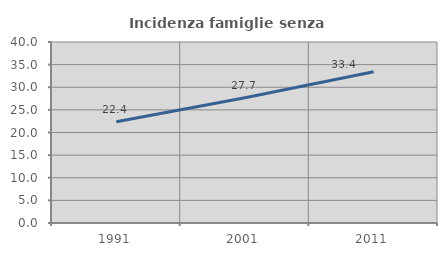
| Category | Incidenza famiglie senza nuclei |
|---|---|
| 1991.0 | 22.387 |
| 2001.0 | 27.696 |
| 2011.0 | 33.445 |